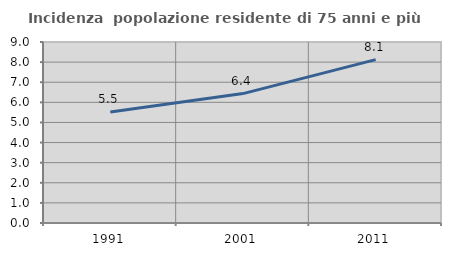
| Category | Incidenza  popolazione residente di 75 anni e più |
|---|---|
| 1991.0 | 5.521 |
| 2001.0 | 6.435 |
| 2011.0 | 8.123 |